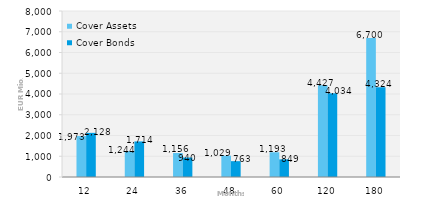
| Category | Cover Assets | Cover Bonds |
|---|---|---|
| 12.0 | 1972.552 | 2127.999 |
| 24.0 | 1243.759 | 1713.525 |
| 36.0 | 1156.02 | 940.126 |
| 48.0 | 1029.024 | 762.649 |
| 60.0 | 1193.163 | 849.008 |
| 120.0 | 4427.455 | 4034.203 |
| 180.0 | 6700.1 | 4324.355 |